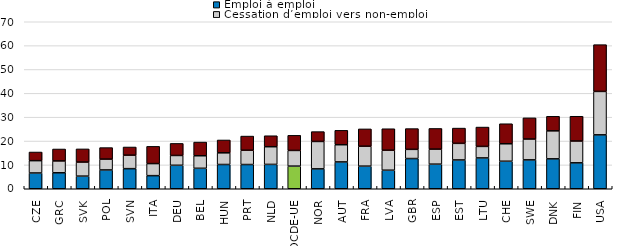
| Category | Emploi à emploi | Cessation d’emploi vers non-emploi | Embauche après non-emploi |
|---|---|---|---|
| CZE | 6.612 | 5.17 | 3.621 |
| GRC | 6.692 | 4.978 | 4.996 |
| SVK | 5.298 | 5.882 | 5.523 |
| POL | 7.888 | 4.541 | 4.826 |
| SVN | 8.425 | 5.651 | 3.43 |
| ITA | 5.492 | 5.059 | 7.221 |
| DEU | 9.843 | 4.113 | 5.051 |
| BEL | 8.577 | 5.253 | 5.739 |
| HUN | 10.166 | 4.895 | 5.383 |
| PRT | 10.156 | 5.989 | 5.94 |
| NLD | 10.204 | 7.417 | 4.602 |
| OCDE-UE | 9.49 | 6.572 | 6.337 |
| NOR | 8.341 | 11.487 | 4.126 |
| AUT | 11.252 | 7.202 | 6.038 |
| FRA | 9.478 | 8.352 | 7.259 |
| LVA | 7.777 | 8.376 | 9.007 |
| GBR | 12.661 | 3.853 | 8.706 |
| ESP | 10.31 | 6.297 | 8.67 |
| EST | 12.074 | 6.952 | 6.402 |
| LTU | 12.924 | 4.829 | 8.109 |
| CHE | 11.537 | 7.316 | 8.404 |
| SWE | 12.105 | 8.737 | 8.873 |
| DNK | 12.541 | 11.732 | 6.103 |
| FIN | 10.868 | 9.144 | 10.381 |
| USA | 22.6 | 18.2 | 19.6 |